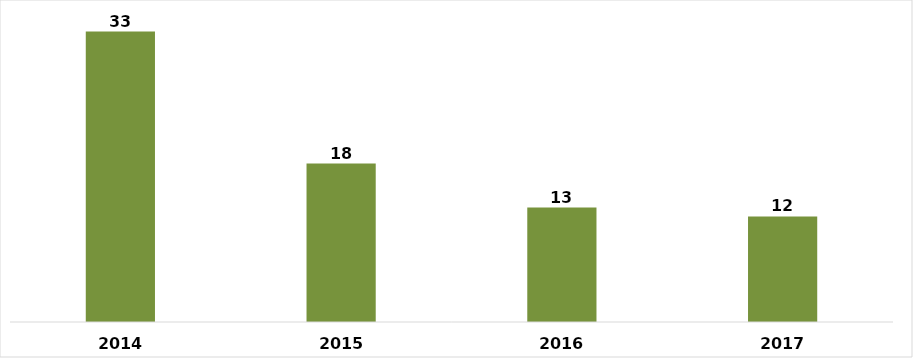
| Category | CANTIDAD |
|---|---|
| 2014.0 | 33 |
| 2015.0 | 18 |
| 2016.0 | 13 |
| 2017.0 | 12 |